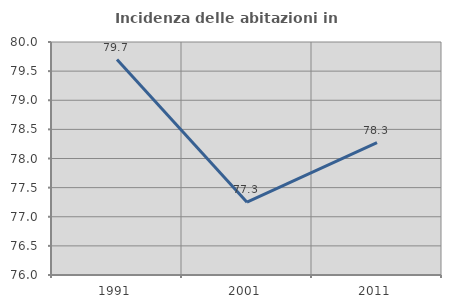
| Category | Incidenza delle abitazioni in proprietà  |
|---|---|
| 1991.0 | 79.699 |
| 2001.0 | 77.25 |
| 2011.0 | 78.272 |